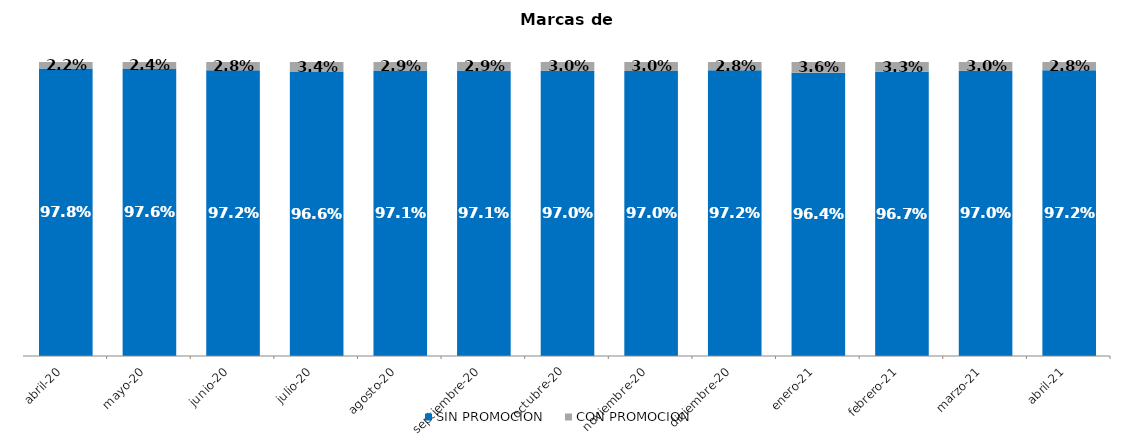
| Category | SIN PROMOCION   | CON PROMOCION   |
|---|---|---|
| 2020-04-01 | 0.978 | 0.022 |
| 2020-05-01 | 0.976 | 0.024 |
| 2020-06-01 | 0.972 | 0.028 |
| 2020-07-01 | 0.966 | 0.034 |
| 2020-08-01 | 0.971 | 0.029 |
| 2020-09-01 | 0.971 | 0.029 |
| 2020-10-01 | 0.97 | 0.03 |
| 2020-11-01 | 0.97 | 0.03 |
| 2020-12-01 | 0.972 | 0.028 |
| 2021-01-01 | 0.964 | 0.036 |
| 2021-02-01 | 0.967 | 0.033 |
| 2021-03-01 | 0.97 | 0.03 |
| 2021-04-01 | 0.972 | 0.028 |